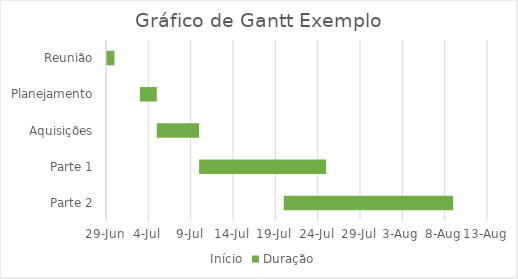
| Category | Início | Duração |
|---|---|---|
| Reunião | 2018-06-29 | 1 |
| Planejamento | 2018-07-03 | 2 |
| Aquisições | 2018-07-05 | 5 |
| Parte 1 | 2018-07-10 | 15 |
| Parte 2 | 2018-07-20 | 20 |